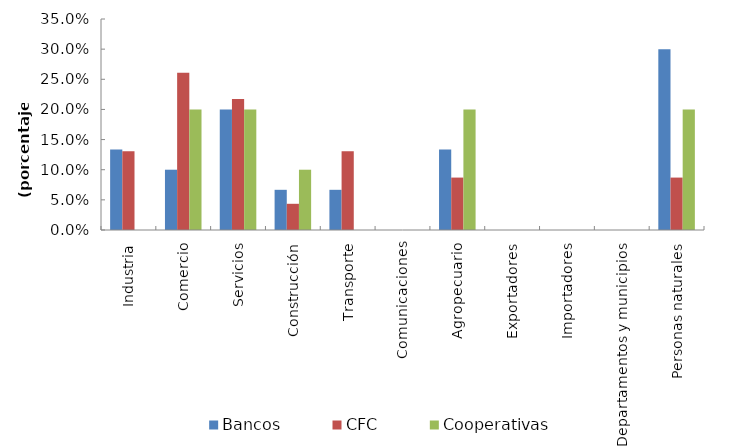
| Category | Bancos | CFC | Cooperativas |
|---|---|---|---|
| Industria | 0.133 | 0.13 | 0 |
| Comercio | 0.1 | 0.261 | 0.2 |
| Servicios | 0.2 | 0.217 | 0.2 |
| Construcción | 0.067 | 0.043 | 0.1 |
| Transporte | 0.067 | 0.13 | 0 |
| Comunicaciones | 0 | 0 | 0 |
| Agropecuario | 0.133 | 0.087 | 0.2 |
| Exportadores | 0 | 0 | 0 |
| Importadores | 0 | 0 | 0 |
| Departamentos y municipios | 0 | 0 | 0 |
| Personas naturales | 0.3 | 0.087 | 0.2 |